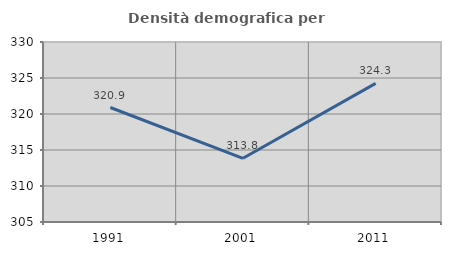
| Category | Densità demografica |
|---|---|
| 1991.0 | 320.902 |
| 2001.0 | 313.846 |
| 2011.0 | 324.251 |